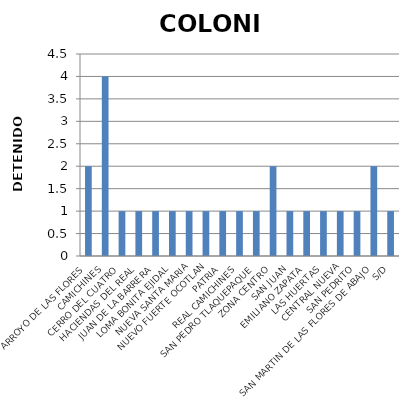
| Category | COLONIA |
|---|---|
| ARROYO DE LAS FLORES | 2 |
| CAMICHINES | 4 |
| CERRO DEL CUATRO | 1 |
| HACIENDAS DEL REAL | 1 |
| JUAN DE LA BARRERA | 1 |
| LOMA BONITA EJIDAL | 1 |
| NUEVA SANTA MARIA | 1 |
| NUEVO FUERTE OCOTLAN | 1 |
| PATRIA | 1 |
| REAL CAMICHINES | 1 |
| SAN PEDRO TLAQUEPAQUE | 1 |
| ZONA CENTRO | 2 |
| SAN JUAN | 1 |
| EMILIANO ZAPATA | 1 |
| LAS HUERTAS | 1 |
| CENTRAL NUEVA | 1 |
| SAN PEDRITO | 1 |
| SAN MARTIN DE LAS FLORES DE ABAJO | 2 |
| S/D | 1 |